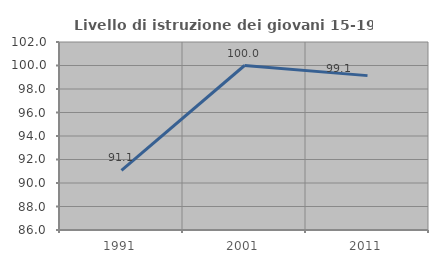
| Category | Livello di istruzione dei giovani 15-19 anni |
|---|---|
| 1991.0 | 91.083 |
| 2001.0 | 100 |
| 2011.0 | 99.138 |